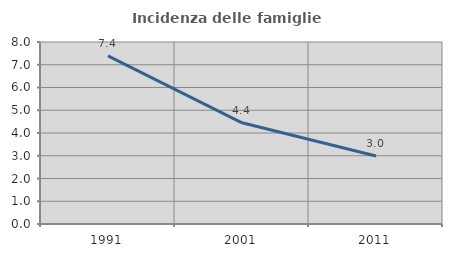
| Category | Incidenza delle famiglie numerose |
|---|---|
| 1991.0 | 7.391 |
| 2001.0 | 4.447 |
| 2011.0 | 2.992 |